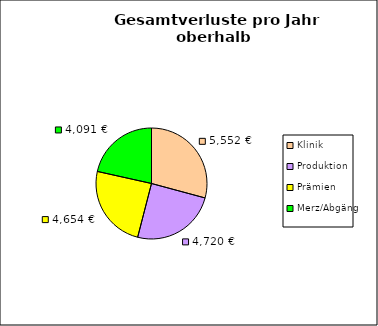
| Category | Losses |
|---|---|
| Klinik | 5552.335 |
| Produktion | 4719.612 |
| Prämien | 4653.75 |
| Merz/Abgäng | 4091 |